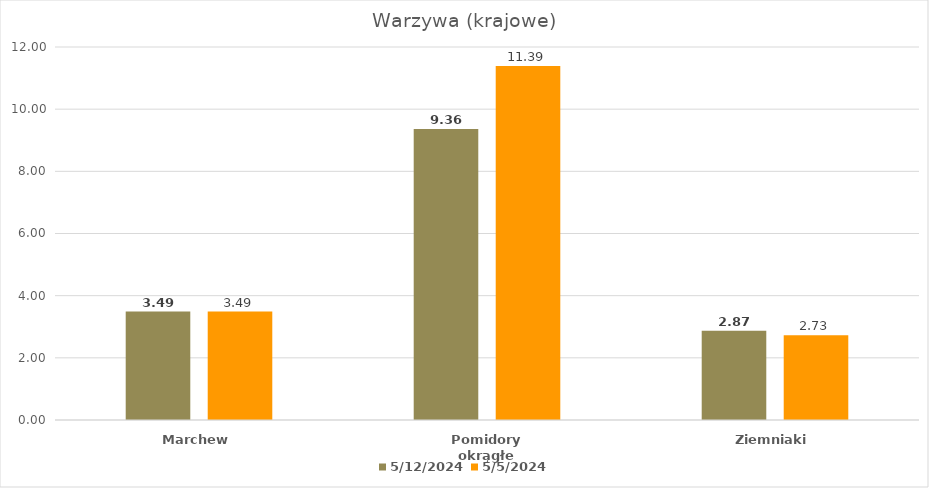
| Category | 2024-05-12 | 2024-05-05 |
|---|---|---|
| Marchew | 3.49 | 3.49 |
| Pomidory okrągłe | 9.36 | 11.39 |
| Ziemniaki | 2.87 | 2.73 |